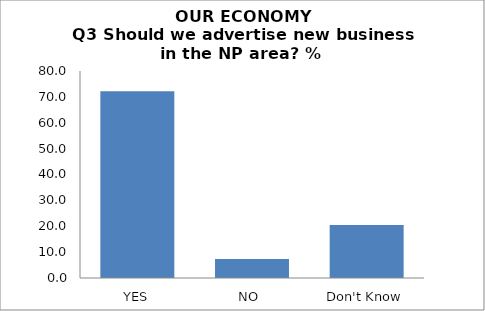
| Category | Series 0 |
|---|---|
| YES | 72.191 |
| NO  | 7.303 |
| Don't Know | 20.506 |